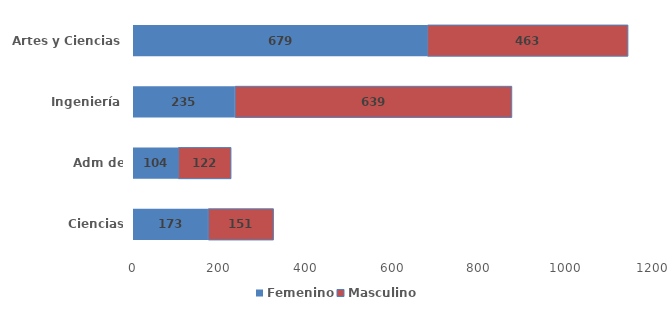
| Category | Femenino | Masculino |
|---|---|---|
| Ciencias Agrícolas | 173 | 151 |
| Adm de Empresas | 104 | 122 |
| Ingeniería | 235 | 639 |
| Artes y Ciencias | 679 | 463 |